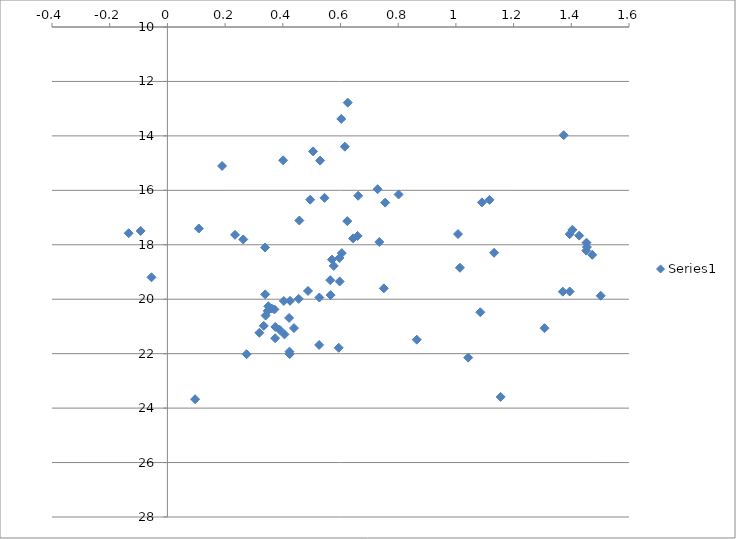
| Category | Series 0 |
|---|---|
| 1.373844 | 13.974 |
| 0.615086999999999 | 14.396 |
| 1.0073680000000031 | 17.605 |
| 0.6250660000000003 | 12.78 |
| 0.401034000000001 | 14.898 |
| 0.5049080000000004 | 14.57 |
| 1.4039709999999985 | 17.45 |
| 1.4541299999999993 | 18.083 |
| 0.6612640000000027 | 16.199 |
| 0.45721599999999896 | 17.108 |
| nan | 10.122 |
| 0.18948900000000002 | 15.104 |
| 0.6234509999999993 | 17.132 |
| 0.728574 | 15.958 |
| 0.5292770000000004 | 14.908 |
| 0.10898199999999747 | 17.403 |
| 0.5445499999999974 | 16.275 |
| 0.7547449999999998 | 16.452 |
| 0.6027470000000008 | 13.377 |
| -0.1342049999999979 | 17.576 |
| 0.6435410000000026 | 17.766 |
| 0.5702619999999996 | 18.545 |
| 0.5764589999999998 | 18.775 |
| -0.055216000000001486 | 19.194 |
| 0.5972480000000004 | 19.348 |
| 0.5643749999999983 | 19.3 |
| 0.48724599999999896 | 19.697 |
| 0.5265699999999995 | 19.937 |
| 0.45519099999999924 | 19.987 |
| 0.34054000000000073 | 20.6 |
| 0.8013060000000003 | 16.152 |
| 0.7344459999999984 | 17.897 |
| 0.4251819999999995 | 20.06 |
| -0.09275699999999887 | 17.491 |
| 0.3497559999999993 | 20.26 |
| 0.3386090000000017 | 18.1 |
| 1.4274009999999997 | 17.664 |
| 1.1550909999999988 | 23.589 |
| 0.09600899999999868 | 23.672 |
| 0.6593860000000014 | 17.674 |
| 0.37101399999999884 | 20.374 |
| 0.3389950000000006 | 19.822 |
| 0.7501940000000005 | 19.601 |
| 0.5962789999999991 | 18.485 |
| 0.6045410000000011 | 18.307 |
| 1.1323240000000006 | 18.294 |
| 1.394407000000001 | 17.609 |
| 1.1165590000000023 | 16.351 |
| 1.452653999999999 | 17.923 |
| 1.4520069999999983 | 18.216 |
| 1.370586000000003 | 19.722 |
| 1.5019659999999995 | 19.872 |
| 0.4033850000000001 | 20.065 |
| 0.34769700000000014 | 20.429 |
| 0.31869100000000117 | 21.233 |
| 0.38931100000000285 | 21.123 |
| 0.5656710000000018 | 19.848 |
| 0.4387529999999984 | 21.058 |
| 0.27449299999999965 | 22.019 |
| 0.4219620000000006 | 20.686 |
| 0.3617290000000004 | 20.342 |
| 0.37400500000000036 | 21.017 |
| 0.37358700000000056 | 21.434 |
| 0.4229009999999995 | 21.926 |
| 0.33397899999999936 | 20.978 |
| 1.3072070000000018 | 21.064 |
| 1.084608000000003 | 20.479 |
| 1.0426549999999999 | 22.144 |
| 0.40578299999999956 | 21.292 |
| 0.42366400000000226 | 22.017 |
| 0.8643260000000019 | 21.486 |
| 0.5259869999999971 | 21.679 |
| 0.49492599999999953 | 16.342 |
| 0.26286899999999847 | 17.803 |
| 0.5938470000000002 | 21.783 |
| 0.23445700000000258 | 17.633 |
| 1.090360999999998 | 16.442 |
| 1.4727080000000008 | 18.37 |
| 1.013978999999999 | 18.845 |
| 1.3945840000000018 | 19.716 |